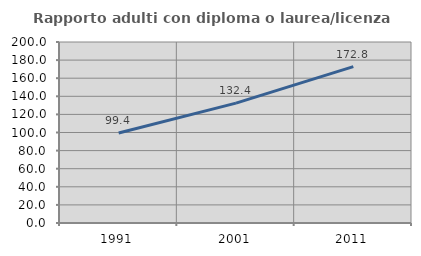
| Category | Rapporto adulti con diploma o laurea/licenza media  |
|---|---|
| 1991.0 | 99.394 |
| 2001.0 | 132.408 |
| 2011.0 | 172.846 |